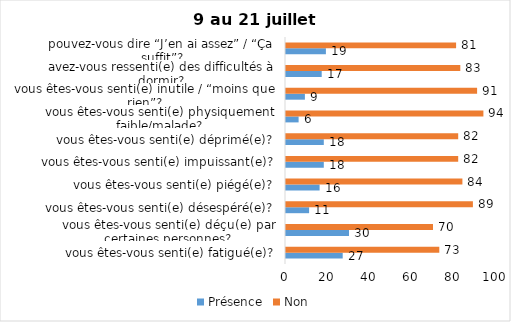
| Category | Présence | Non |
|---|---|---|
| vous êtes-vous senti(e) fatigué(e)? | 27 | 73 |
| vous êtes-vous senti(e) déçu(e) par certaines personnes? | 30 | 70 |
| vous êtes-vous senti(e) désespéré(e)? | 11 | 89 |
| vous êtes-vous senti(e) piégé(e)? | 16 | 84 |
| vous êtes-vous senti(e) impuissant(e)? | 18 | 82 |
| vous êtes-vous senti(e) déprimé(e)? | 18 | 82 |
| vous êtes-vous senti(e) physiquement faible/malade? | 6 | 94 |
| vous êtes-vous senti(e) inutile / “moins que rien”? | 9 | 91 |
| avez-vous ressenti(e) des difficultés à dormir? | 17 | 83 |
| pouvez-vous dire “J’en ai assez” / “Ça suffit”? | 19 | 81 |